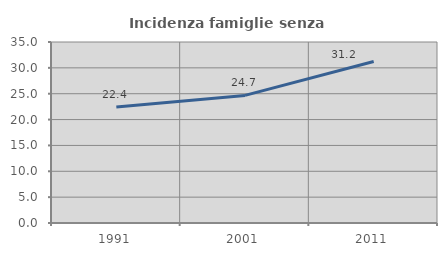
| Category | Incidenza famiglie senza nuclei |
|---|---|
| 1991.0 | 22.418 |
| 2001.0 | 24.674 |
| 2011.0 | 31.243 |